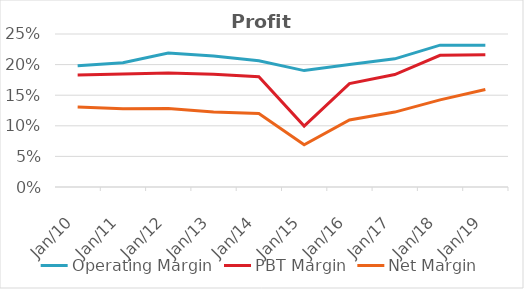
| Category | Operating Margin | PBT Margin | Net Margin |
|---|---|---|---|
| 2010-12-31 | 0.198 | 0.183 | 0.131 |
| 2011-12-31 | 0.203 | 0.185 | 0.128 |
| 2012-12-31 | 0.219 | 0.186 | 0.128 |
| 2013-12-31 | 0.214 | 0.184 | 0.123 |
| 2014-12-31 | 0.206 | 0.18 | 0.12 |
| 2015-12-31 | 0.19 | 0.1 | 0.069 |
| 2016-12-31 | 0.2 | 0.169 | 0.11 |
| 2017-12-31 | 0.209 | 0.184 | 0.122 |
| 2018-12-31 | 0.232 | 0.215 | 0.142 |
| 2019-12-31 | 0.232 | 0.216 | 0.159 |